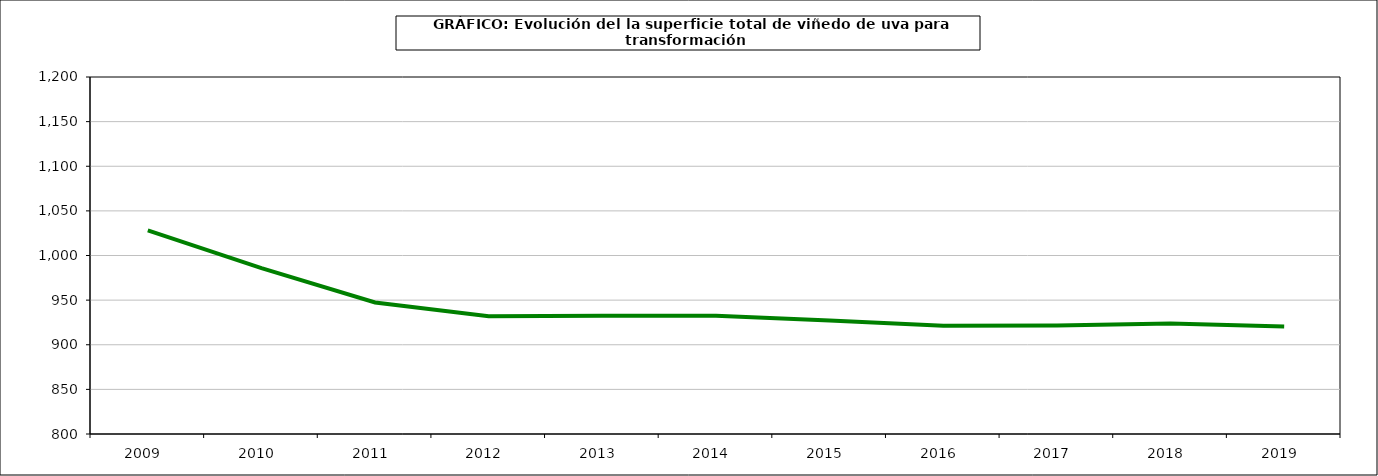
| Category | superficie |
|---|---|
| 2009.0 | 1028.258 |
| 2010.0 | 985.844 |
| 2011.0 | 947.36 |
| 2012.0 | 931.893 |
| 2013.0 | 932.509 |
| 2014.0 | 932.611 |
| 2015.0 | 927.067 |
| 2016.0 | 921.18 |
| 2017.0 | 921.642 |
| 2018.0 | 923.712 |
| 2019.0 | 920.525 |